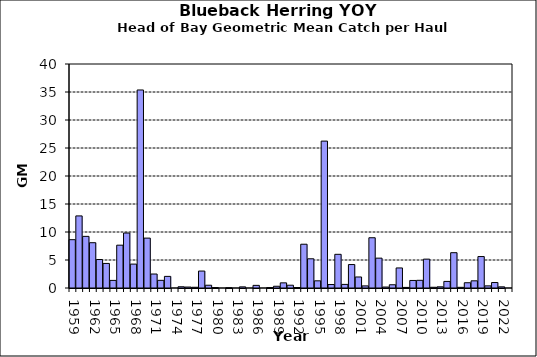
| Category | Series 0 |
|---|---|
| 1959.0 | 8.629 |
| 1960.0 | 12.872 |
| 1961.0 | 9.221 |
| 1962.0 | 8.086 |
| 1963.0 | 5.086 |
| 1964.0 | 4.389 |
| 1965.0 | 1.357 |
| 1966.0 | 7.646 |
| 1967.0 | 9.816 |
| 1968.0 | 4.267 |
| 1969.0 | 35.361 |
| 1970.0 | 8.908 |
| 1971.0 | 2.494 |
| 1972.0 | 1.369 |
| 1973.0 | 2.075 |
| 1974.0 | 0 |
| 1975.0 | 0.222 |
| 1976.0 | 0.168 |
| 1977.0 | 0.13 |
| 1978.0 | 3.026 |
| 1979.0 | 0.494 |
| 1980.0 | 0.079 |
| 1981.0 | 0 |
| 1982.0 | 0.044 |
| 1983.0 | 0 |
| 1984.0 | 0.203 |
| 1985.0 | 0 |
| 1986.0 | 0.47 |
| 1987.0 | 0 |
| 1988.0 | 0.074 |
| 1989.0 | 0.311 |
| 1990.0 | 0.919 |
| 1991.0 | 0.498 |
| 1992.0 | 0.086 |
| 1993.0 | 7.818 |
| 1994.0 | 5.216 |
| 1995.0 | 1.282 |
| 1996.0 | 26.232 |
| 1997.0 | 0.621 |
| 1998.0 | 6.015 |
| 1999.0 | 0.643 |
| 2000.0 | 4.188 |
| 2001.0 | 1.97 |
| 2002.0 | 0.376 |
| 2003.0 | 8.975 |
| 2004.0 | 5.33 |
| 2005.0 | 0.171 |
| 2006.0 | 0.58 |
| 2007.0 | 3.58 |
| 2008.0 | 0.104 |
| 2009.0 | 1.348 |
| 2010.0 | 1.373 |
| 2011.0 | 5.155 |
| 2012.0 | 0.128 |
| 2013.0 | 0.211 |
| 2014.0 | 1.176 |
| 2015.0 | 6.304 |
| 2016.0 | 0.121 |
| 2017.0 | 0.939 |
| 2018.0 | 1.281 |
| 2019.0 | 5.615 |
| 2020.0 | 0.38 |
| 2021.0 | 0.977 |
| 2022.0 | 0.208 |
| 2023.0 | 0 |